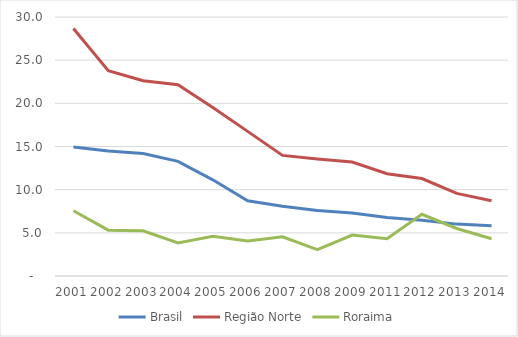
| Category | Brasil | Região Norte | Roraima |
|---|---|---|---|
| 2001.0 | 14.955 | 28.66 | 7.56 |
| 2002.0 | 14.475 | 23.779 | 5.311 |
| 2003.0 | 14.19 | 22.619 | 5.232 |
| 2004.0 | 13.285 | 22.145 | 3.823 |
| 2005.0 | 11.14 | 19.518 | 4.591 |
| 2006.0 | 8.721 | 16.753 | 4.056 |
| 2007.0 | 8.08 | 13.97 | 4.545 |
| 2008.0 | 7.593 | 13.543 | 3.046 |
| 2009.0 | 7.309 | 13.198 | 4.736 |
| 2011.0 | 6.776 | 11.848 | 4.307 |
| 2012.0 | 6.452 | 11.29 | 7.148 |
| 2013.0 | 6.009 | 9.568 | 5.506 |
| 2014.0 | 5.816 | 8.718 | 4.322 |